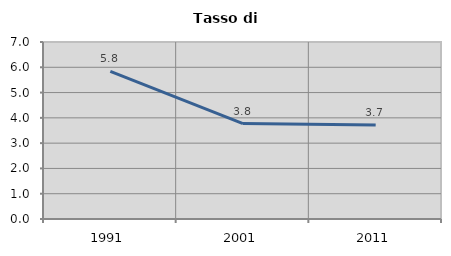
| Category | Tasso di disoccupazione   |
|---|---|
| 1991.0 | 5.836 |
| 2001.0 | 3.774 |
| 2011.0 | 3.718 |